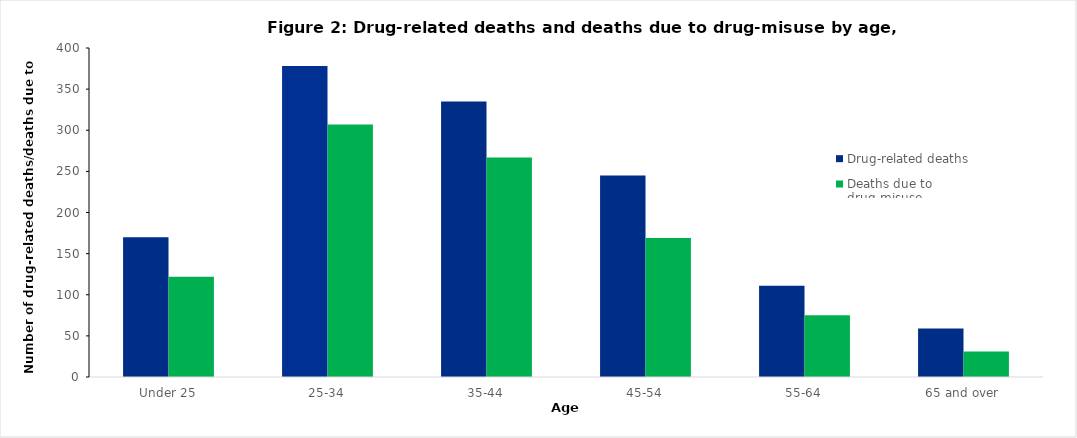
| Category | Drug-related deaths | Deaths due to drug-misuse |
|---|---|---|
| Under 25 | 170 | 122 |
| 25-34 | 378 | 307 |
| 35-44 | 335 | 267 |
| 45-54 | 245 | 169 |
| 55-64 | 111 | 75 |
| 65 and over | 59 | 31 |